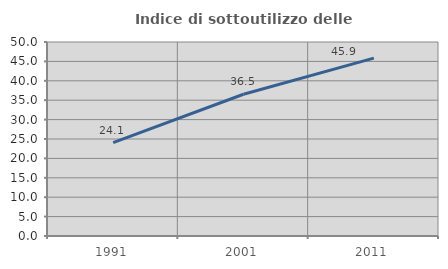
| Category | Indice di sottoutilizzo delle abitazioni  |
|---|---|
| 1991.0 | 24.079 |
| 2001.0 | 36.528 |
| 2011.0 | 45.855 |